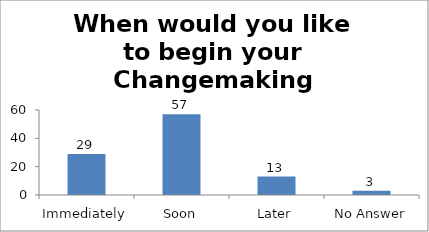
| Category | When would you like to begin your Changemaking journey?  |
|---|---|
| Immediately | 29 |
| Soon | 57 |
| Later | 13 |
| No Answer | 3 |